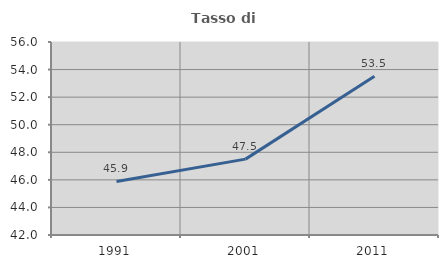
| Category | Tasso di occupazione   |
|---|---|
| 1991.0 | 45.882 |
| 2001.0 | 47.505 |
| 2011.0 | 53.523 |